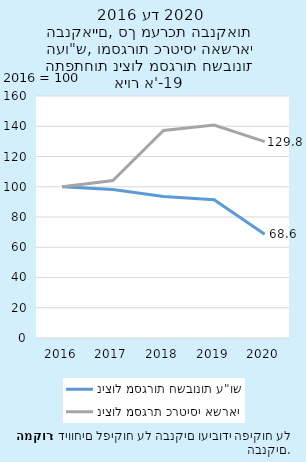
| Category | ניצול מסגרות חשבונות ע"וש | ניצול מסגרת כרטיסי אשראי |
|---|---|---|
| 2016.0 | 100 | 100 |
| 2017.0 | 98.116 | 104.163 |
| 2018.0 | 93.523 | 137.199 |
| 2019.0 | 91.453 | 140.848 |
| 2020.0 | 68.572 | 129.806 |